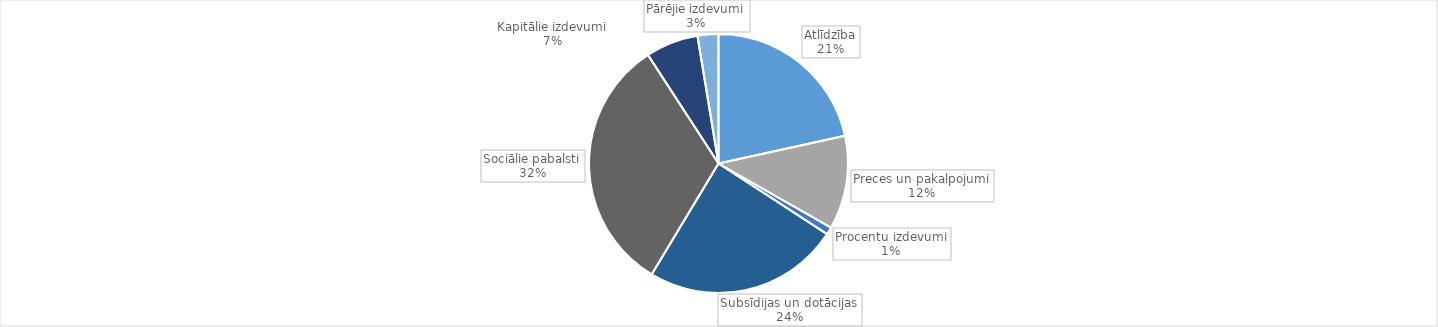
| Category | Series 0 |
|---|---|
| Atlīdzība | 280440.526 |
| Preces un pakalpojumi | 152022.003 |
| Procentu izdevumi | 12163.562 |
| Subsīdijas un dotācijas | 317933.567 |
| Sociālie pabalsti | 418779.903 |
| Kapitālie izdevumi | 85455.893 |
| Pārējie izdevumi | 33832.424 |